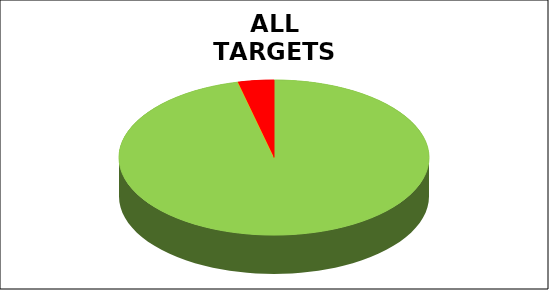
| Category | Series 0 |
|---|---|
| Green | 0.963 |
| Amber | 0 |
| Red | 0.037 |